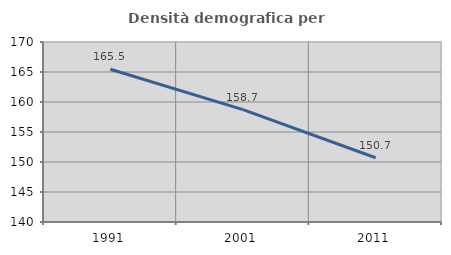
| Category | Densità demografica |
|---|---|
| 1991.0 | 165.464 |
| 2001.0 | 158.719 |
| 2011.0 | 150.707 |